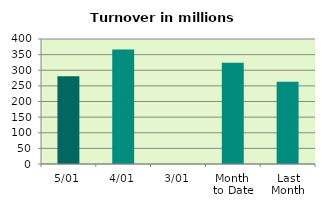
| Category | Series 0 |
|---|---|
| 5/01 | 281.068 |
| 4/01 | 366.737 |
| 3/01 | 0 |
| Month 
to Date | 323.903 |
| Last
Month | 263.133 |